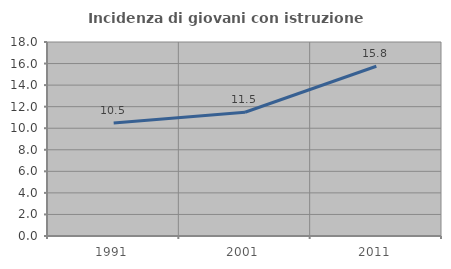
| Category | Incidenza di giovani con istruzione universitaria |
|---|---|
| 1991.0 | 10.478 |
| 2001.0 | 11.485 |
| 2011.0 | 15.75 |